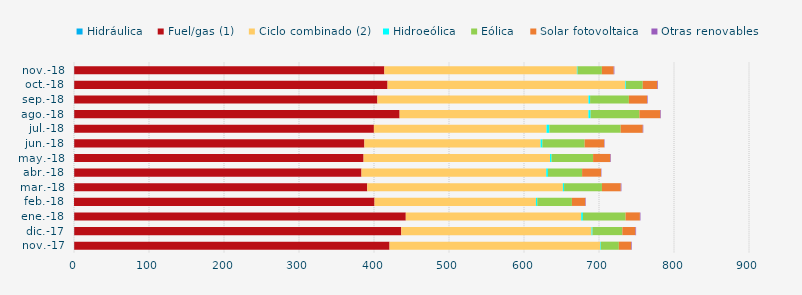
| Category | Hidráulica | Fuel/gas (1) | Ciclo combinado (2) | Hidroeólica | Eólica | Solar fotovoltaica | Otras renovables |
|---|---|---|---|---|---|---|---|
| nov.-17 | 0.274 | 420.436 | 280.937 | 0.791 | 24.032 | 16.488 | 0.803 |
| dic.-17 | 0.311 | 436.048 | 253.67 | 1.286 | 39.81 | 17.54 | 0.782 |
| ene.-18 | 0.279 | 442.105 | 233.902 | 2.258 | 56.908 | 19.063 | 0.762 |
| feb.-18 | 0.034 | 400.679 | 215.217 | 1.754 | 46.207 | 17.867 | 0.647 |
| mar.-18 | 0.31 | 390.68 | 260.839 | 1.6 | 50.516 | 25.105 | 0.837 |
| abr.-18 | 0.276 | 383.044 | 246.338 | 2.263 | 45.549 | 25.191 | 0.539 |
| may.-18 | 0.308 | 385.794 | 248.617 | 2.034 | 55.352 | 23.051 | 0.751 |
| jun.-18 | 0.294 | 386.903 | 234.948 | 2.322 | 56.421 | 25.993 | 0.531 |
| jul.-18 | 0.296 | 399.578 | 230.146 | 3.716 | 95.158 | 29.45 | 0.702 |
| ago.-18 | 0.308 | 433.847 | 251.789 | 2.859 | 65.078 | 27.842 | 0.816 |
| sep.-18 | 0.288 | 404.236 | 281.475 | 2.166 | 51.688 | 24.19 | 0.783 |
| oct.-18 | 0.297 | 417.763 | 317.069 | 0.873 | 22.336 | 19.456 | 0.813 |
| nov.-18 | 0.289 | 413.521 | 256.697 | 0.901 | 32.427 | 15.814 | 0.85 |